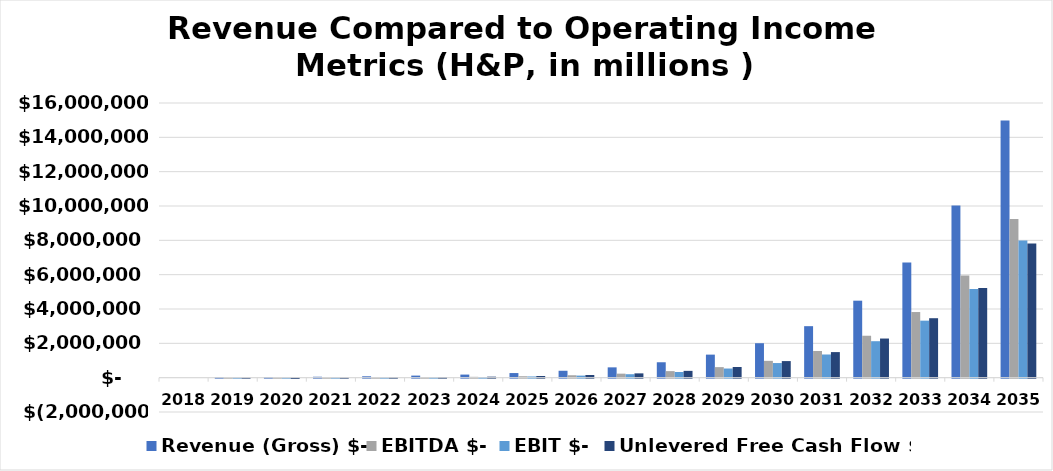
| Category | Revenue (Gross) | EBITDA | EBIT | Unlevered Free Cash Flow |
|---|---|---|---|---|
| 2018.0 | 0 | 0 | 0 | 0 |
| 2019.0 | 24578 | 80 | -818 | -1462 |
| 2020.0 | 31536 | 1993.675 | 259.675 | -13999.325 |
| 2021.0 | 53823 | 6494.646 | 4373.646 | 2855.646 |
| 2022.0 | 80460.402 | 13947.388 | 10602.422 | 19874.23 |
| 2023.0 | 120280.852 | 26762.079 | 21486.831 | 34635.2 |
| 2024.0 | 179808.738 | 48261.748 | 39942.309 | 58472.78 |
| 2025.0 | 268797.417 | 83682.536 | 70562.194 | 96501.949 |
| 2026.0 | 401827.253 | 141230.497 | 120538.793 | 156554.52 |
| 2027.0 | 600694.542 | 233705.175 | 201072.898 | 250548.285 |
| 2028.0 | 897982.729 | 380989.475 | 329526.073 | 396504.977 |
| 2029.0 | 1342401.044 | 613860.299 | 532698.883 | 621496.734 |
| 2030.0 | 2006765.281 | 979809.897 | 851812.619 | 965899.611 |
| 2031.0 | 2999928.309 | 1551924.321 | 1350063.585 | 1489446.978 |
| 2032.0 | 4484615.089 | 2442404.303 | 2124055.683 | 2279686.109 |
| 2033.0 | 6704084.373 | 3823128.295 | 3321070.067 | 3463498.176 |
| 2034.0 | 10021985.474 | 5956887.158 | 5165105.918 | 5222233.229 |
| 2035.0 | 14981940.449 | 9244775.74 | 7996080.875 | 7810504.384 |